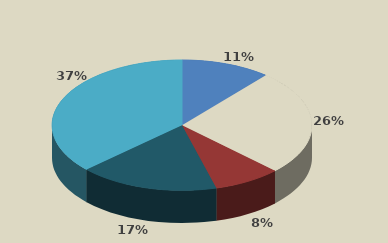
| Category | Series 0 |
|---|---|
| AGRICOLTURA | 14704 |
| INDUSTRIA | 34541 |
| COSTRUZIONI | 11123 |
| COMMERCIO | 22903 |
| ALTRI SERVIZI | 48684 |